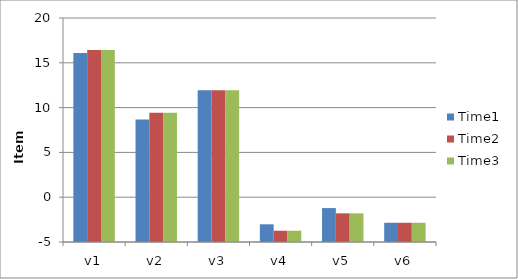
| Category | Time1 | Time2 | Time3 |
|---|---|---|---|
| v1 | 16.09 | 16.425 | 16.425 |
| v2 | 8.674 | 9.413 | 9.413 |
| v3 | 11.95 | 11.95 | 11.95 |
| v4 | -3.024 | -3.744 | -3.744 |
| v5 | -1.215 | -1.802 | -1.802 |
| v6 | -2.854 | -2.854 | -2.854 |